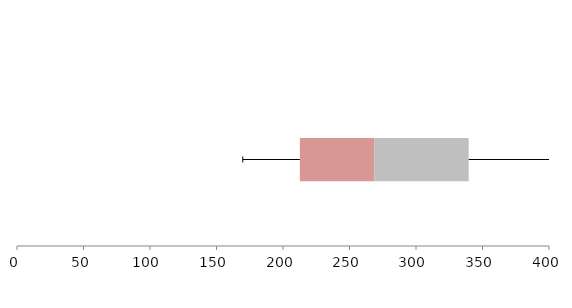
| Category | Series 1 | Series 2 | Series 3 |
|---|---|---|---|
| 0 | 212.687 | 56.09 | 70.833 |